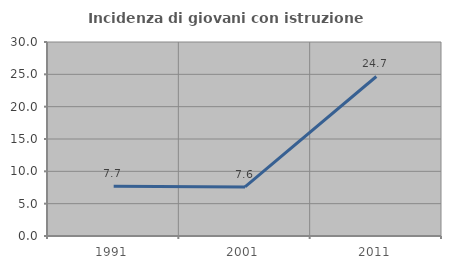
| Category | Incidenza di giovani con istruzione universitaria |
|---|---|
| 1991.0 | 7.692 |
| 2001.0 | 7.581 |
| 2011.0 | 24.667 |